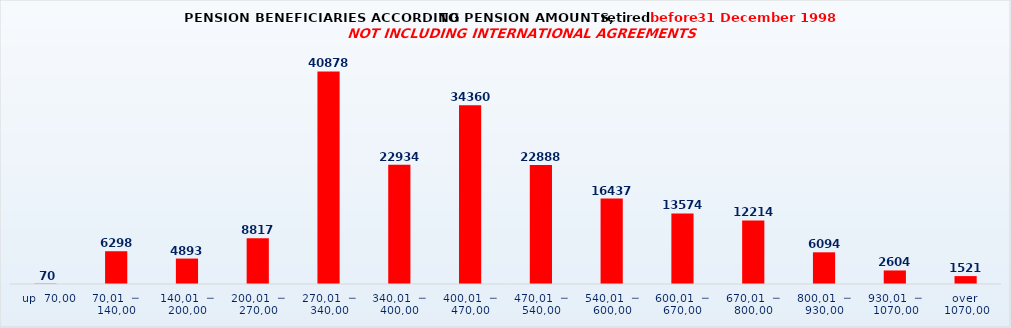
| Category | Series 0 |
|---|---|
|   up  70,00 | 70 |
| 70,01  ─  140,00 | 6298 |
| 140,01  ─  200,00 | 4893 |
| 200,01  ─  270,00 | 8817 |
| 270,01  ─  340,00 | 40878 |
| 340,01  ─  400,00 | 22934 |
| 400,01  ─  470,00 | 34360 |
| 470,01  ─  540,00 | 22888 |
| 540,01  ─  600,00 | 16437 |
| 600,01  ─  670,00 | 13574 |
| 670,01  ─  800,00 | 12214 |
| 800,01  ─  930,00 | 6094 |
| 930,01  ─  1070,00 | 2604 |
| over  1070,00 | 1521 |